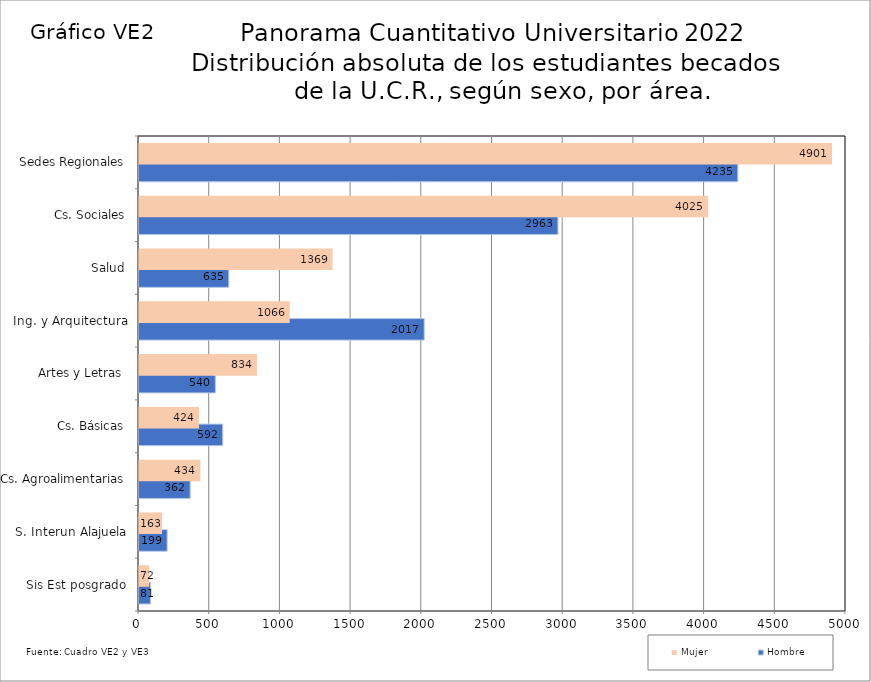
| Category | Hombre | Mujer |
|---|---|---|
| Sis Est posgrado | 81 | 72 |
| S. Interun Alajuela | 199 | 163 |
| Cs. Agroalimentarias | 362 | 434 |
| Cs. Básicas | 592 | 424 |
| Artes y Letras  | 540 | 834 |
| Ing. y Arquitectura | 2017 | 1066 |
| Salud | 635 | 1369 |
| Cs. Sociales | 2963 | 4025 |
| Sedes Regionales | 4235 | 4901 |